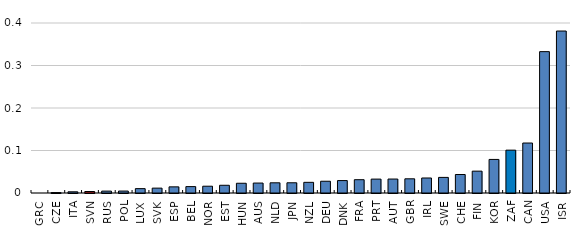
| Category | total |
|---|---|
| GRC | 0 |
| CZE | 0.001 |
| ITA | 0.003 |
| SVN | 0.004 |
| RUS | 0.004 |
| POL | 0.005 |
| LUX | 0.01 |
| SVK | 0.011 |
| ESP | 0.014 |
| BEL | 0.015 |
| NOR | 0.016 |
| EST | 0.018 |
| HUN | 0.023 |
| AUS | 0.023 |
| NLD | 0.024 |
| JPN | 0.024 |
| NZL | 0.025 |
| DEU | 0.028 |
| DNK | 0.029 |
| FRA | 0.031 |
| PRT | 0.033 |
| AUT | 0.033 |
| GBR | 0.033 |
| IRL | 0.035 |
| SWE | 0.037 |
| CHE | 0.044 |
| FIN | 0.051 |
| KOR | 0.079 |
| ZAF | 0.101 |
| CAN | 0.118 |
| USA | 0.333 |
| ISR | 0.381 |